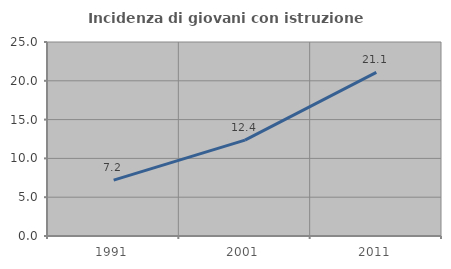
| Category | Incidenza di giovani con istruzione universitaria |
|---|---|
| 1991.0 | 7.204 |
| 2001.0 | 12.358 |
| 2011.0 | 21.085 |